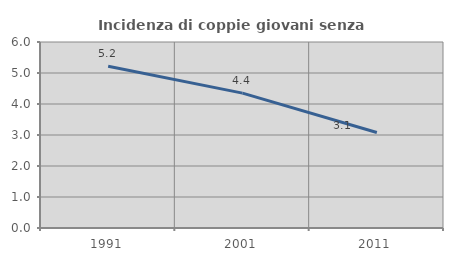
| Category | Incidenza di coppie giovani senza figli |
|---|---|
| 1991.0 | 5.217 |
| 2001.0 | 4.351 |
| 2011.0 | 3.08 |